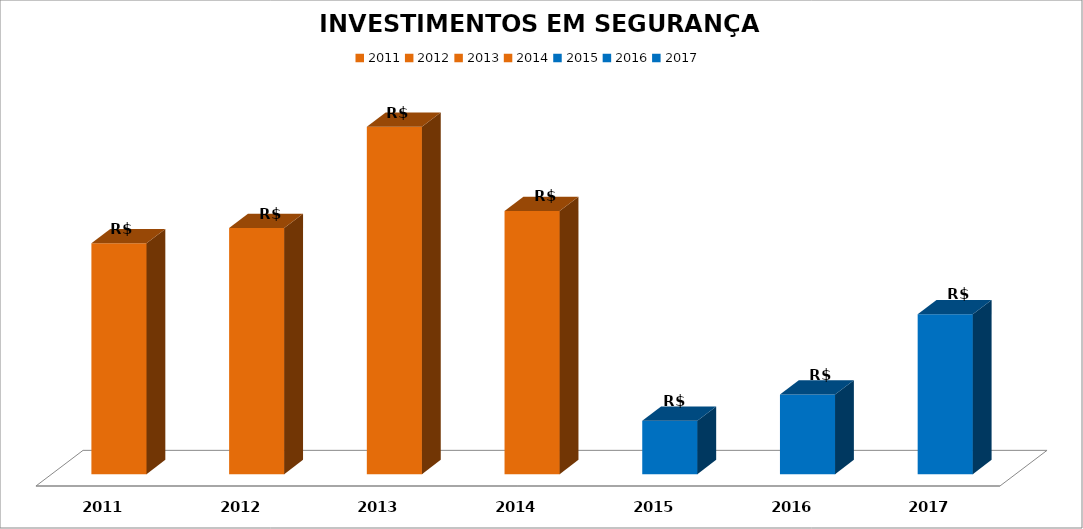
| Category | INVESTIMENTOS Total |
|---|---|
| 2011.0 | 74974005.4 |
| 2012.0 | 79983500.8 |
| 2013.0 | 112875673.44 |
| 2014.0 | 85454066.24 |
| 2015.0 | 17357442.6 |
| 2016.0 | 25886666.52 |
| 2017.0 | 51966607.72 |